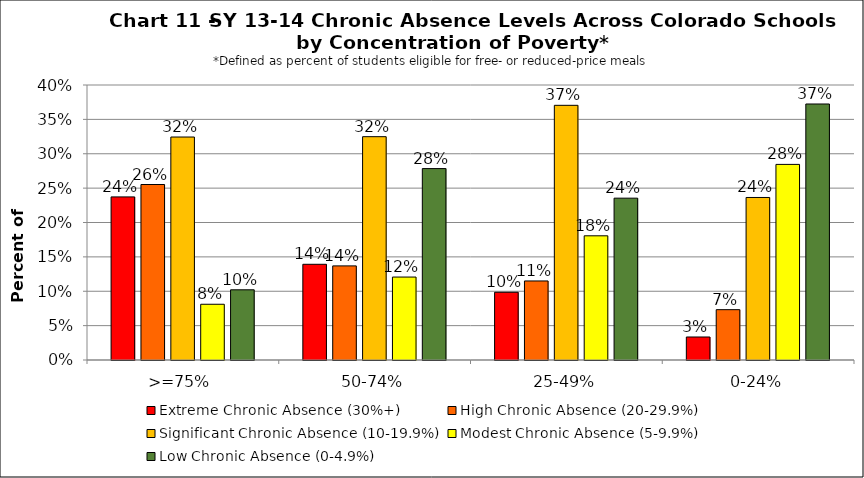
| Category | Extreme Chronic Absence (30%+) | High Chronic Absence (20-29.9%) | Significant Chronic Absence (10-19.9%) | Modest Chronic Absence (5-9.9%) | Low Chronic Absence (0-4.9%) |
|---|---|---|---|---|---|
| 0 | 0.237 | 0.255 | 0.324 | 0.081 | 0.102 |
| 1 | 0.139 | 0.137 | 0.325 | 0.121 | 0.278 |
| 2 | 0.099 | 0.115 | 0.37 | 0.181 | 0.235 |
| 3 | 0.033 | 0.073 | 0.236 | 0.285 | 0.372 |